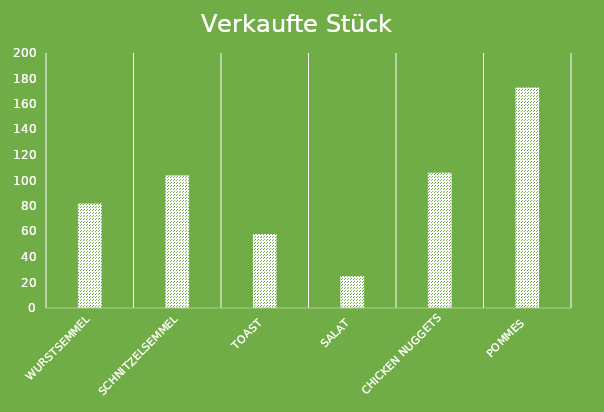
| Category | Series 0 |
|---|---|
| Wurstsemmel | 82 |
| Schnitzelsemmel | 104 |
| Toast | 58 |
| Salat | 25 |
| Chicken Nuggets | 106 |
| Pommes | 173 |